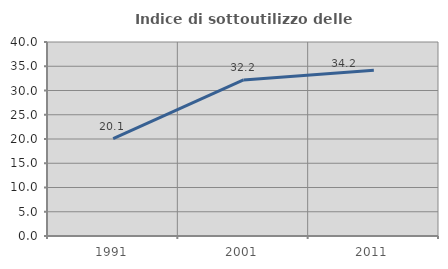
| Category | Indice di sottoutilizzo delle abitazioni  |
|---|---|
| 1991.0 | 20.082 |
| 2001.0 | 32.18 |
| 2011.0 | 34.161 |